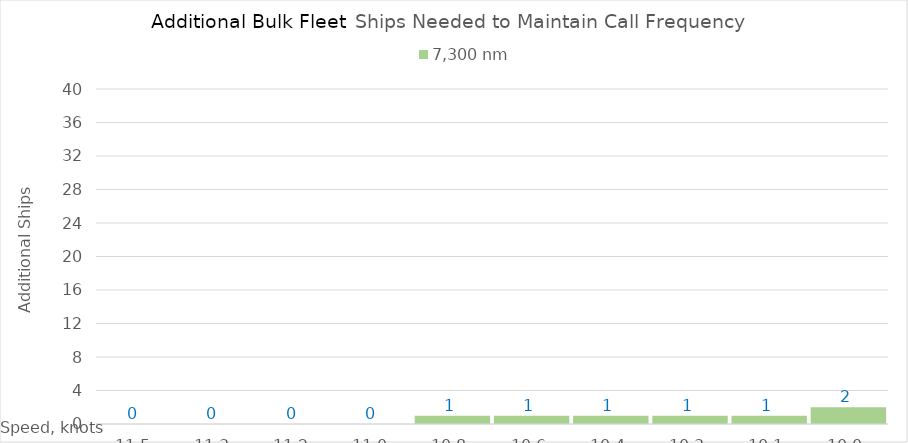
| Category | 7,300 |
|---|---|
| 11.52 | 0 |
| 11.34 | 0 |
| 11.16 | 0 |
| 10.98 | 0 |
| 10.8 | 1 |
| 10.620000000000001 | 1 |
| 10.440000000000001 | 1 |
| 10.260000000000002 | 1 |
| 10.080000000000002 | 1 |
| 10.0 | 2 |